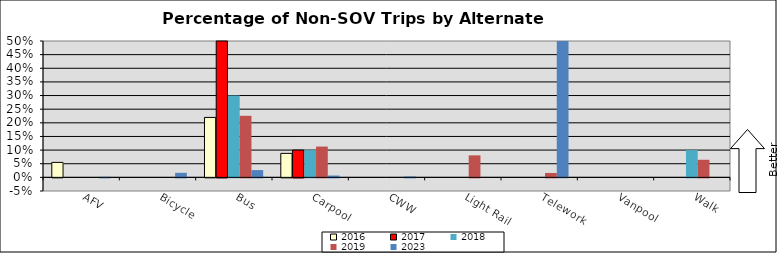
| Category | 2016 | 2017 | 2018 | 2019 | 2023 |
|---|---|---|---|---|---|
| AFV | 0.055 | 0 | 0 | 0 | 0.002 |
| Bicycle | 0 | 0 | 0 | 0 | 0.017 |
| Bus | 0.22 | 0.5 | 0.3 | 0.226 | 0.027 |
| Carpool | 0.088 | 0.1 | 0.1 | 0.113 | 0.007 |
| CWW | 0 | 0 | 0 | 0 | 0.003 |
| Light Rail | 0 | 0 | 0 | 0.081 | 0 |
| Telework | 0 | 0 | 0 | 0.016 | 0.607 |
| Vanpool | 0 | 0 | 0 | 0 | 0 |
| Walk | 0 | 0 | 0.1 | 0.065 | 0 |